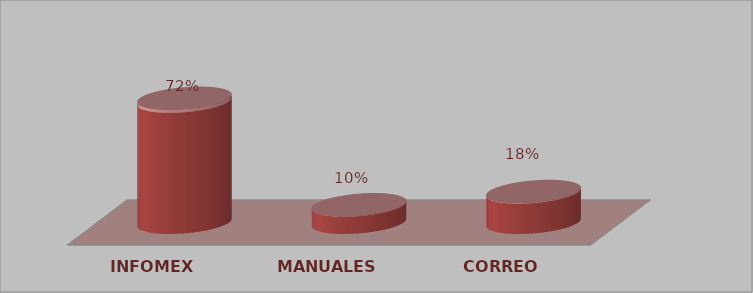
| Category | Series 0 | Series 1 |
|---|---|---|
| INFOMEX | 28 | 0.718 |
| MANUALES | 4 | 0.103 |
| CORREO | 7 | 0.179 |